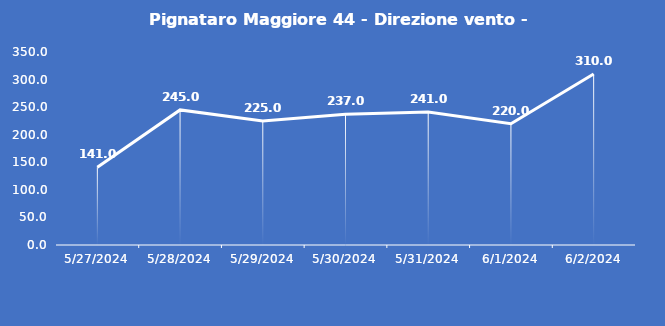
| Category | Pignataro Maggiore 44 - Direzione vento - Grezzo (°N) |
|---|---|
| 5/27/24 | 141 |
| 5/28/24 | 245 |
| 5/29/24 | 225 |
| 5/30/24 | 237 |
| 5/31/24 | 241 |
| 6/1/24 | 220 |
| 6/2/24 | 310 |